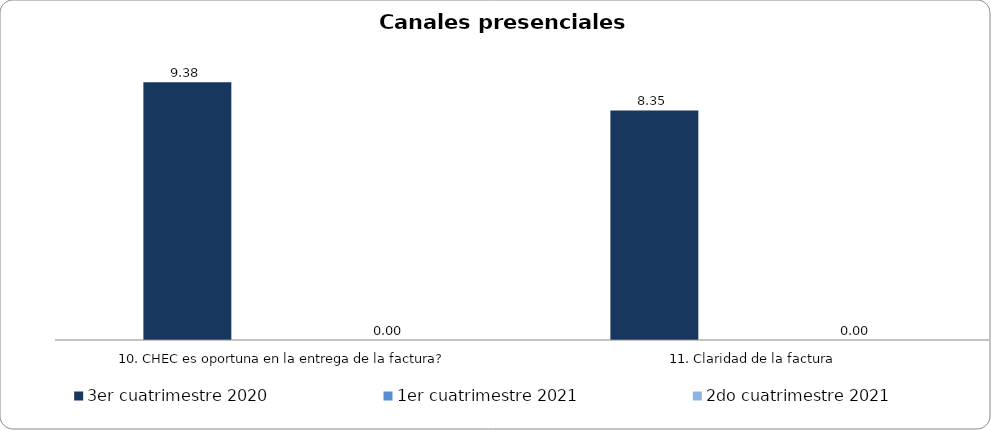
| Category | 3er cuatrimestre 2020 | Septiembre - Octubre 2018 | 1er cuatrimestre 2021 | Noviembre - Diciembre 2018 | 1er cuatrimestre 2019 | 2do cuatrimestre 2019 | 2do cuatrimestre 2021 |
|---|---|---|---|---|---|---|---|
| 10. CHEC es oportuna en la entrega de la factura? | 9.375 |  | 0 |  |  |  | 0 |
| 11. Claridad de la factura | 8.348 |  | 0 |  |  |  | 0 |